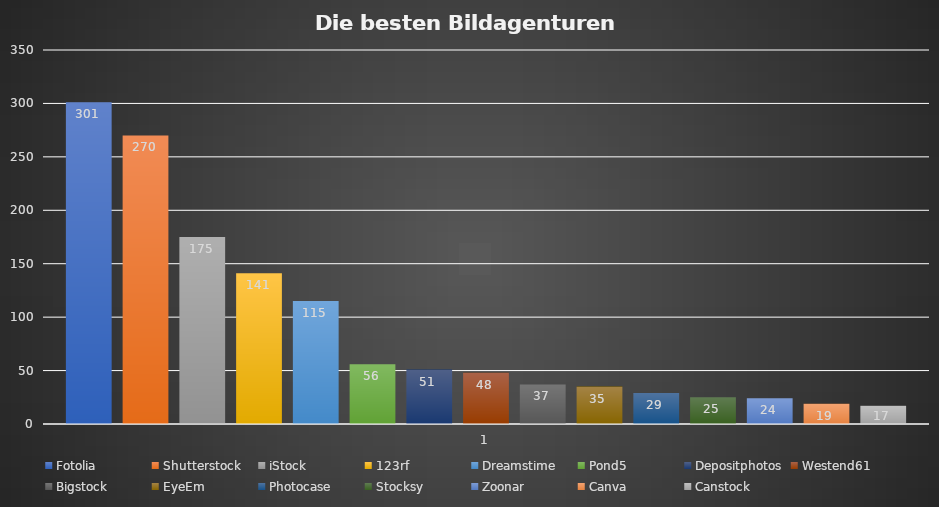
| Category | Fotolia | Shutterstock | iStock | 123rf | Dreamstime | Pond5 | Depositphotos | Westend61 | Bigstock | EyeEm | Photocase | Stocksy | Zoonar | Canva | Canstock |
|---|---|---|---|---|---|---|---|---|---|---|---|---|---|---|---|
| 0 | 301 | 270 | 175 | 141 | 115 | 56 | 51 | 48 | 37 | 35 | 29 | 25 | 24 | 19 | 17 |